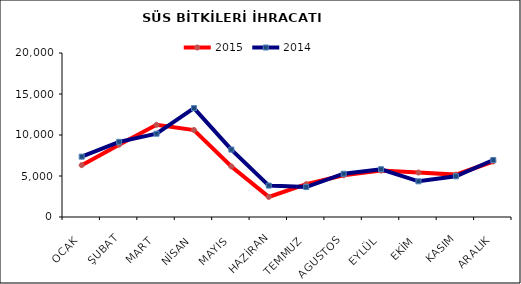
| Category | 2015 | 2014 |
|---|---|---|
| OCAK | 6323.249 | 7358.726 |
| ŞUBAT | 8819.949 | 9166.988 |
| MART | 11241.368 | 10157.392 |
| NİSAN | 10605.655 | 13276.79 |
| MAYIS | 6164.764 | 8222.476 |
| HAZİRAN | 2449.981 | 3831.858 |
| TEMMUZ | 4008.56 | 3651.376 |
| AGUSTOS | 5086.787 | 5275.718 |
| EYLÜL | 5656.94 | 5825.466 |
| EKİM | 5422.515 | 4353.962 |
| KASIM | 5168.36 | 4965.075 |
| ARALIK | 6767.907 | 6948.336 |